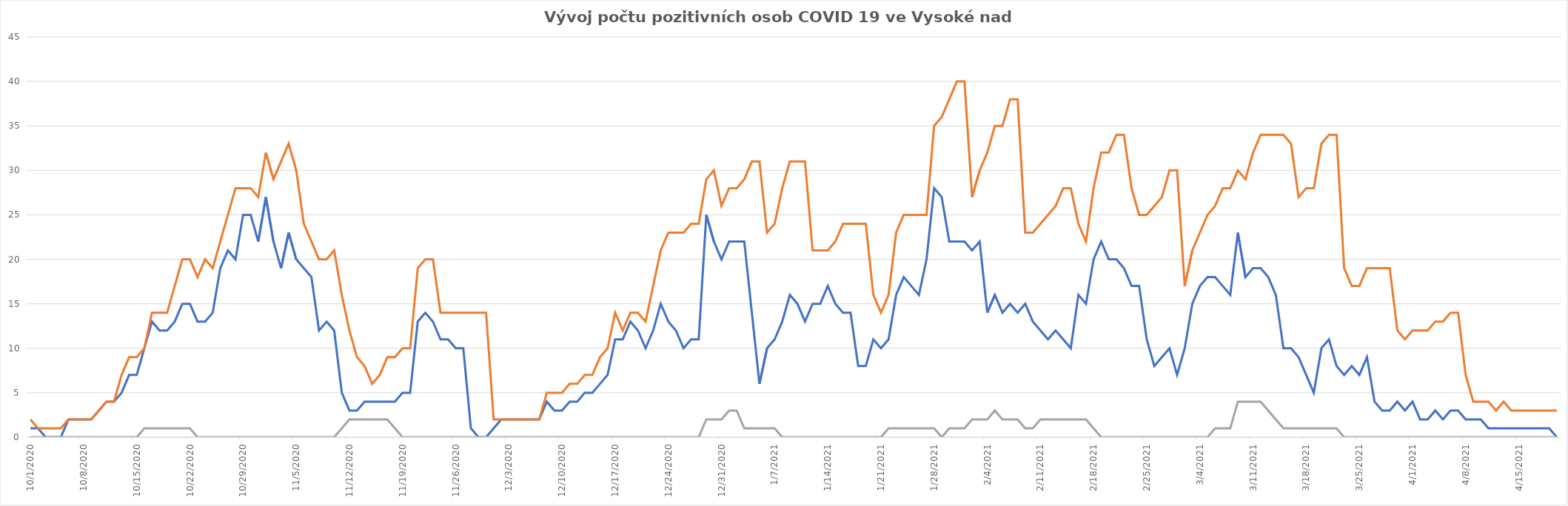
| Category | Series 0 | Series 1 | Series 2 |
|---|---|---|---|
| 10/1/20 | 1 | 2 | 0 |
| 10/2/20 | 1 | 1 | 0 |
| 10/3/20 | 0 | 1 | 0 |
| 10/4/20 | 0 | 1 | 0 |
| 10/5/20 | 0 | 1 | 0 |
| 10/6/20 | 2 | 2 | 0 |
| 10/7/20 | 2 | 2 | 0 |
| 10/8/20 | 2 | 2 | 0 |
| 10/9/20 | 2 | 2 | 0 |
| 10/10/20 | 3 | 3 | 0 |
| 10/11/20 | 4 | 4 | 0 |
| 10/12/20 | 4 | 4 | 0 |
| 10/13/20 | 5 | 7 | 0 |
| 10/14/20 | 7 | 9 | 0 |
| 10/15/20 | 7 | 9 | 0 |
| 10/16/20 | 10 | 10 | 1 |
| 10/17/20 | 13 | 14 | 1 |
| 10/18/20 | 12 | 14 | 1 |
| 10/19/20 | 12 | 14 | 1 |
| 10/20/20 | 13 | 17 | 1 |
| 10/21/20 | 15 | 20 | 1 |
| 10/22/20 | 15 | 20 | 1 |
| 10/23/20 | 13 | 18 | 0 |
| 10/24/20 | 13 | 20 | 0 |
| 10/25/20 | 14 | 19 | 0 |
| 10/26/20 | 19 | 22 | 0 |
| 10/27/20 | 21 | 25 | 0 |
| 10/28/20 | 20 | 28 | 0 |
| 10/29/20 | 25 | 28 | 0 |
| 10/30/20 | 25 | 28 | 0 |
| 10/31/20 | 22 | 27 | 0 |
| 11/1/20 | 27 | 32 | 0 |
| 11/2/20 | 22 | 29 | 0 |
| 11/3/20 | 19 | 31 | 0 |
| 11/4/20 | 23 | 33 | 0 |
| 11/5/20 | 20 | 30 | 0 |
| 11/6/20 | 19 | 24 | 0 |
| 11/7/20 | 18 | 22 | 0 |
| 11/8/20 | 12 | 20 | 0 |
| 11/9/20 | 13 | 20 | 0 |
| 11/10/20 | 12 | 21 | 0 |
| 11/11/20 | 5 | 16 | 1 |
| 11/12/20 | 3 | 12 | 2 |
| 11/13/20 | 3 | 9 | 2 |
| 11/14/20 | 4 | 8 | 2 |
| 11/15/20 | 4 | 6 | 2 |
| 11/16/20 | 4 | 7 | 2 |
| 11/17/20 | 4 | 9 | 2 |
| 11/18/20 | 4 | 9 | 1 |
| 11/19/20 | 5 | 10 | 0 |
| 11/20/20 | 5 | 10 | 0 |
| 11/21/20 | 13 | 19 | 0 |
| 11/22/20 | 14 | 20 | 0 |
| 11/23/20 | 13 | 20 | 0 |
| 11/24/20 | 11 | 14 | 0 |
| 11/25/20 | 11 | 14 | 0 |
| 11/26/20 | 10 | 14 | 0 |
| 11/27/20 | 10 | 14 | 0 |
| 11/28/20 | 1 | 14 | 0 |
| 11/29/20 | 0 | 14 | 0 |
| 11/30/20 | 0 | 14 | 0 |
| 12/1/20 | 1 | 2 | 0 |
| 12/2/20 | 2 | 2 | 0 |
| 12/3/20 | 2 | 2 | 0 |
| 12/4/20 | 2 | 2 | 0 |
| 12/5/20 | 2 | 2 | 0 |
| 12/6/20 | 2 | 2 | 0 |
| 12/7/20 | 2 | 2 | 0 |
| 12/8/20 | 4 | 5 | 0 |
| 12/9/20 | 3 | 5 | 0 |
| 12/10/20 | 3 | 5 | 0 |
| 12/11/20 | 4 | 6 | 0 |
| 12/12/20 | 4 | 6 | 0 |
| 12/13/20 | 5 | 7 | 0 |
| 12/14/20 | 5 | 7 | 0 |
| 12/15/20 | 6 | 9 | 0 |
| 12/16/20 | 7 | 10 | 0 |
| 12/17/20 | 11 | 14 | 0 |
| 12/18/20 | 11 | 12 | 0 |
| 12/19/20 | 13 | 14 | 0 |
| 12/20/20 | 12 | 14 | 0 |
| 12/21/20 | 10 | 13 | 0 |
| 12/22/20 | 12 | 17 | 0 |
| 12/23/20 | 15 | 21 | 0 |
| 12/24/20 | 13 | 23 | 0 |
| 12/25/20 | 12 | 23 | 0 |
| 12/26/20 | 10 | 23 | 0 |
| 12/27/20 | 11 | 24 | 0 |
| 12/28/20 | 11 | 24 | 0 |
| 12/29/20 | 25 | 29 | 2 |
| 12/30/20 | 22 | 30 | 2 |
| 12/31/20 | 20 | 26 | 2 |
| 1/1/21 | 22 | 28 | 3 |
| 1/2/21 | 22 | 28 | 3 |
| 1/3/21 | 22 | 29 | 1 |
| 1/4/21 | 14 | 31 | 1 |
| 1/5/21 | 6 | 31 | 1 |
| 1/6/21 | 10 | 23 | 1 |
| 1/7/21 | 11 | 24 | 1 |
| 1/8/21 | 13 | 28 | 0 |
| 1/9/21 | 16 | 31 | 0 |
| 1/10/21 | 15 | 31 | 0 |
| 1/11/21 | 13 | 31 | 0 |
| 1/12/21 | 15 | 21 | 0 |
| 1/13/21 | 15 | 21 | 0 |
| 1/14/21 | 17 | 21 | 0 |
| 1/15/21 | 15 | 22 | 0 |
| 1/16/21 | 14 | 24 | 0 |
| 1/17/21 | 14 | 24 | 0 |
| 1/18/21 | 8 | 24 | 0 |
| 1/19/21 | 8 | 24 | 0 |
| 1/20/21 | 11 | 16 | 0 |
| 1/21/21 | 10 | 14 | 0 |
| 1/22/21 | 11 | 16 | 1 |
| 1/23/21 | 16 | 23 | 1 |
| 1/24/21 | 18 | 25 | 1 |
| 1/25/21 | 17 | 25 | 1 |
| 1/26/21 | 16 | 25 | 1 |
| 1/27/21 | 20 | 25 | 1 |
| 1/28/21 | 28 | 35 | 1 |
| 1/29/21 | 27 | 36 | 0 |
| 1/30/21 | 22 | 38 | 1 |
| 1/31/21 | 22 | 40 | 1 |
| 2/1/21 | 22 | 40 | 1 |
| 2/2/21 | 21 | 27 | 2 |
| 2/3/21 | 22 | 30 | 2 |
| 2/4/21 | 14 | 32 | 2 |
| 2/5/21 | 16 | 35 | 3 |
| 2/6/21 | 14 | 35 | 2 |
| 2/7/21 | 15 | 38 | 2 |
| 2/8/21 | 14 | 38 | 2 |
| 2/9/21 | 15 | 23 | 1 |
| 2/10/21 | 13 | 23 | 1 |
| 2/11/21 | 12 | 24 | 2 |
| 2/12/21 | 11 | 25 | 2 |
| 2/13/21 | 12 | 26 | 2 |
| 2/14/21 | 11 | 28 | 2 |
| 2/15/21 | 10 | 28 | 2 |
| 2/16/21 | 16 | 24 | 2 |
| 2/17/21 | 15 | 22 | 2 |
| 2/18/21 | 20 | 28 | 1 |
| 2/19/21 | 22 | 32 | 0 |
| 2/20/21 | 20 | 32 | 0 |
| 2/21/21 | 20 | 34 | 0 |
| 2/22/21 | 19 | 34 | 0 |
| 2/23/21 | 17 | 28 | 0 |
| 2/24/21 | 17 | 25 | 0 |
| 2/25/21 | 11 | 25 | 0 |
| 2/26/21 | 8 | 26 | 0 |
| 2/27/21 | 9 | 27 | 0 |
| 2/28/21 | 10 | 30 | 0 |
| 3/1/21 | 7 | 30 | 0 |
| 3/2/21 | 10 | 17 | 0 |
| 3/3/21 | 15 | 21 | 0 |
| 3/4/21 | 17 | 23 | 0 |
| 3/5/21 | 18 | 25 | 0 |
| 3/6/21 | 18 | 26 | 1 |
| 3/7/21 | 17 | 28 | 1 |
| 3/8/21 | 16 | 28 | 1 |
| 3/9/21 | 23 | 30 | 4 |
| 3/10/21 | 18 | 29 | 4 |
| 3/11/21 | 19 | 32 | 4 |
| 3/12/21 | 19 | 34 | 4 |
| 3/13/21 | 18 | 34 | 3 |
| 3/14/21 | 16 | 34 | 2 |
| 3/15/21 | 10 | 34 | 1 |
| 3/16/21 | 10 | 33 | 1 |
| 3/17/21 | 9 | 27 | 1 |
| 3/18/21 | 7 | 28 | 1 |
| 3/19/21 | 5 | 28 | 1 |
| 3/20/21 | 10 | 33 | 1 |
| 3/21/21 | 11 | 34 | 1 |
| 3/22/21 | 8 | 34 | 1 |
| 3/23/21 | 7 | 19 | 0 |
| 3/24/21 | 8 | 17 | 0 |
| 3/25/21 | 7 | 17 | 0 |
| 3/26/21 | 9 | 19 | 0 |
| 3/27/21 | 4 | 19 | 0 |
| 3/28/21 | 3 | 19 | 0 |
| 3/29/21 | 3 | 19 | 0 |
| 3/30/21 | 4 | 12 | 0 |
| 3/31/21 | 3 | 11 | 0 |
| 4/1/21 | 4 | 12 | 0 |
| 4/2/21 | 2 | 12 | 0 |
| 4/3/21 | 2 | 12 | 0 |
| 4/4/21 | 3 | 13 | 0 |
| 4/5/21 | 2 | 13 | 0 |
| 4/6/21 | 3 | 14 | 0 |
| 4/7/21 | 3 | 14 | 0 |
| 4/8/21 | 2 | 7 | 0 |
| 4/9/21 | 2 | 4 | 0 |
| 4/10/21 | 2 | 4 | 0 |
| 4/11/21 | 1 | 4 | 0 |
| 4/12/21 | 1 | 3 | 0 |
| 4/13/21 | 1 | 4 | 0 |
| 4/14/21 | 1 | 3 | 0 |
| 4/15/21 | 1 | 3 | 0 |
| 4/16/21 | 1 | 3 | 0 |
| 4/17/21 | 1 | 3 | 0 |
| 4/18/21 | 1 | 3 | 0 |
| 4/19/21 | 1 | 3 | 0 |
| 4/20/21 | 0 | 3 | 0 |